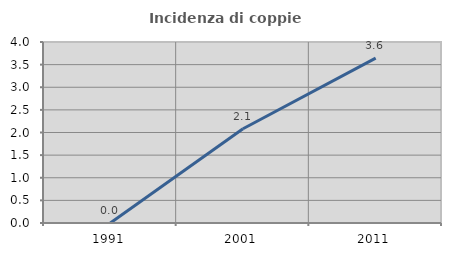
| Category | Incidenza di coppie miste |
|---|---|
| 1991.0 | 0 |
| 2001.0 | 2.083 |
| 2011.0 | 3.644 |